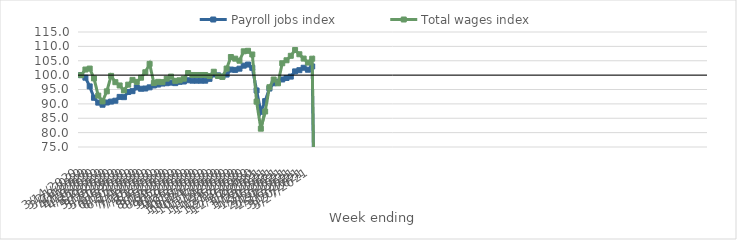
| Category | Payroll jobs index | Total wages index |
|---|---|---|
| 14/03/2020 | 100 | 100 |
| 21/03/2020 | 99.111 | 101.944 |
| 28/03/2020 | 96.076 | 102.28 |
| 04/04/2020 | 92.129 | 98.865 |
| 11/04/2020 | 90.432 | 92.877 |
| 18/04/2020 | 89.706 | 90.88 |
| 25/04/2020 | 90.467 | 94.359 |
| 02/05/2020 | 90.798 | 99.738 |
| 09/05/2020 | 91.103 | 97.544 |
| 16/05/2020 | 92.424 | 96.405 |
| 23/05/2020 | 92.336 | 94.678 |
| 30/05/2020 | 94.136 | 96.689 |
| 06/06/2020 | 94.426 | 98.35 |
| 13/06/2020 | 95.721 | 97.653 |
| 20/06/2020 | 95.258 | 99.107 |
| 27/06/2020 | 95.347 | 101.002 |
| 04/07/2020 | 95.753 | 103.902 |
| 11/07/2020 | 96.404 | 97.27 |
| 18/07/2020 | 96.718 | 97.658 |
| 25/07/2020 | 97.066 | 97.568 |
| 01/08/2020 | 97.19 | 98.768 |
| 08/08/2020 | 97.389 | 99.487 |
| 15/08/2020 | 97.215 | 98.006 |
| 22/08/2020 | 97.663 | 98.209 |
| 29/08/2020 | 97.78 | 98.752 |
| 05/09/2020 | 98.219 | 100.735 |
| 12/09/2020 | 98.068 | 100.048 |
| 19/09/2020 | 98.068 | 100.048 |
| 26/09/2020 | 98.068 | 100.048 |
| 03/10/2020 | 98.068 | 100.048 |
| 10/10/2020 | 98.707 | 99.681 |
| 17/10/2020 | 100.216 | 101.174 |
| 24/10/2020 | 99.92 | 99.717 |
| 31/10/2020 | 99.513 | 99.386 |
| 07/11/2020 | 100.191 | 102.292 |
| 14/11/2020 | 101.936 | 106.3 |
| 21/11/2020 | 101.818 | 105.729 |
| 28/11/2020 | 102.244 | 105.012 |
| 05/12/2020 | 103.291 | 108.278 |
| 12/12/2020 | 103.676 | 108.452 |
| 19/12/2020 | 102.526 | 107.184 |
| 26/12/2020 | 94.664 | 90.773 |
| 02/01/2021 | 87.268 | 81.375 |
| 09/01/2021 | 90.946 | 87.341 |
| 16/01/2021 | 95.335 | 95.799 |
| 23/01/2021 | 97.165 | 98.476 |
| 30/01/2021 | 97.706 | 97.153 |
| 06/02/2021 | 98.487 | 104.125 |
| 13/02/2021 | 99.004 | 105.166 |
| 20/02/2021 | 99.485 | 106.72 |
| 27/02/2021 | 101.298 | 108.74 |
| 06/03/2021 | 101.719 | 107.258 |
| 13/03/2021 | 102.561 | 105.756 |
| 20/03/2021 | 101.88 | 104.365 |
| 27/03/2021 | 103.015 | 105.712 |